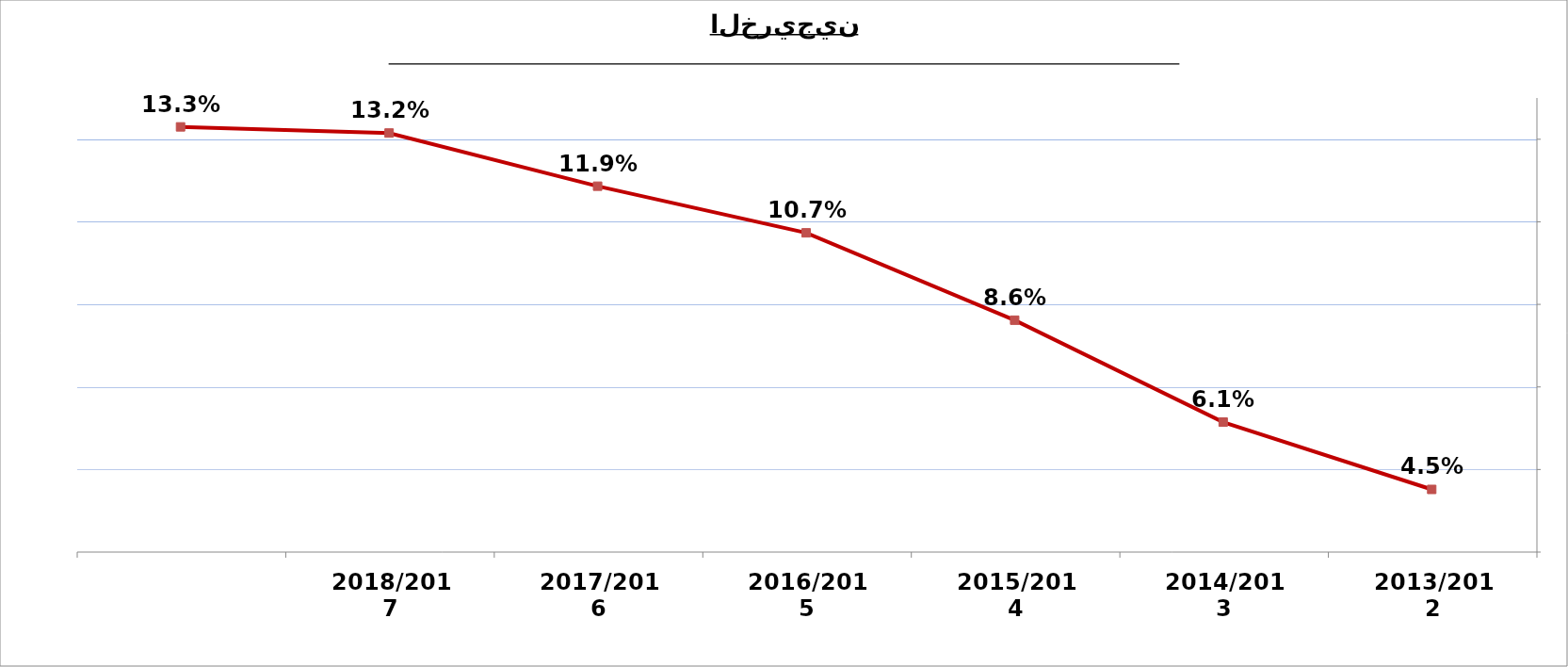
| Category | النسبة المأوية بالمقارنة مع جملة الخريجين |
|---|---|
| 2013/2012 | 0.045 |
| 2014/2013 | 0.061 |
| 2015/2014 | 0.086 |
| 2016/2015 | 0.107 |
| 2017/2016 | 0.119 |
| 2018/2017 | 0.132 |